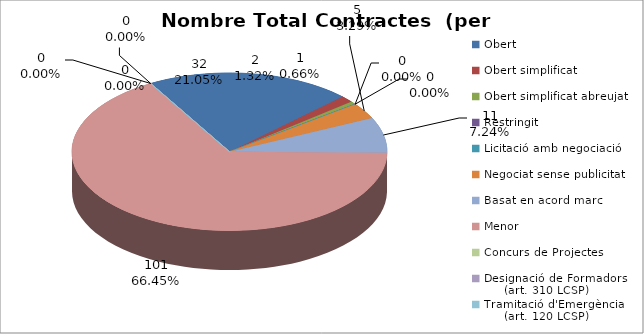
| Category | Nombre Total Contractes |
|---|---|
| Obert | 32 |
| Obert simplificat | 2 |
| Obert simplificat abreujat | 1 |
| Restringit | 0 |
| Licitació amb negociació | 0 |
| Negociat sense publicitat | 5 |
| Basat en acord marc | 11 |
| Menor | 101 |
| Concurs de Projectes | 0 |
| Designació de Formadors
     (art. 310 LCSP) | 0 |
| Tramitació d'Emergència
     (art. 120 LCSP) | 0 |